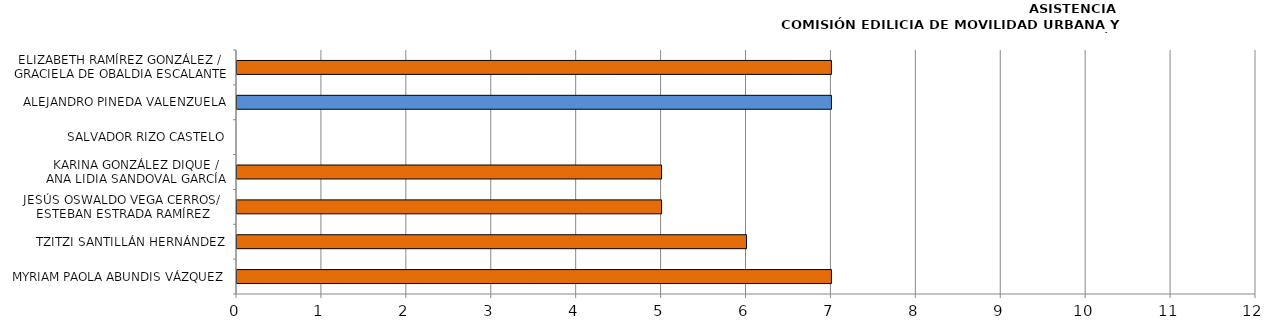
| Category | Series 0 |
|---|---|
| MYRIAM PAOLA ABUNDIS VÁZQUEZ | 7 |
| TZITZI SANTILLÁN HERNÁNDEZ | 6 |
| JESÚS OSWALDO VEGA CERROS/ 
ESTEBAN ESTRADA RAMÍREZ | 5 |
| KARINA GONZÁLEZ DIQUE /
ANA LIDIA SANDOVAL GARCÍA | 5 |
| SALVADOR RIZO CASTELO | 0 |
| ALEJANDRO PINEDA VALENZUELA | 7 |
| ELIZABETH RAMÍREZ GONZÁLEZ /
GRACIELA DE OBALDIA ESCALANTE | 7 |